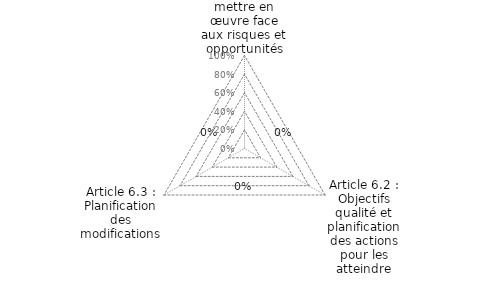
| Category | Article 6 : Planification |
|---|---|
| Article 6.1 : Actions à mettre en œuvre face aux risques et opportunités | 0 |
| Article 6.2 : Objectifs qualité et planification des actions pour les atteindre | 0 |
| Article 6.3 : Planification des modifications | 0 |